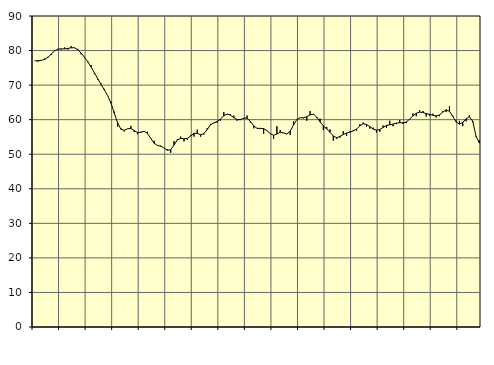
| Category | Piggar | Series 1 |
|---|---|---|
| nan | 77 | 77.01 |
| 87.0 | 76.8 | 77.05 |
| 87.0 | 77.1 | 77.18 |
| 87.0 | 77.7 | 77.41 |
| nan | 78.2 | 78.04 |
| 88.0 | 78.7 | 78.99 |
| 88.0 | 80.1 | 79.9 |
| 88.0 | 80.2 | 80.42 |
| nan | 80.3 | 80.49 |
| 89.0 | 80.9 | 80.5 |
| 89.0 | 80.3 | 80.61 |
| 89.0 | 81.3 | 80.8 |
| nan | 80.9 | 80.8 |
| 90.0 | 80.5 | 80.25 |
| 90.0 | 78.9 | 79.25 |
| 90.0 | 77.9 | 78.09 |
| nan | 76.6 | 76.79 |
| 91.0 | 75.8 | 75.27 |
| 91.0 | 73.2 | 73.56 |
| 91.0 | 71.6 | 71.87 |
| nan | 70.5 | 70.22 |
| 92.0 | 68.9 | 68.61 |
| 92.0 | 67 | 66.95 |
| 92.0 | 65.2 | 64.77 |
| nan | 62.3 | 61.89 |
| 93.0 | 58 | 59.05 |
| 93.0 | 57.5 | 57.22 |
| 93.0 | 56.6 | 56.93 |
| nan | 57.4 | 57.37 |
| 94.0 | 58.2 | 57.44 |
| 94.0 | 56.4 | 56.85 |
| 94.0 | 55.8 | 56.27 |
| nan | 56.2 | 56.4 |
| 95.0 | 56.5 | 56.61 |
| 95.0 | 56.5 | 56.01 |
| 95.0 | 54.6 | 54.56 |
| nan | 53.9 | 53.17 |
| 96.0 | 52.5 | 52.55 |
| 96.0 | 52.5 | 52.34 |
| 96.0 | 51.8 | 51.81 |
| nan | 51.4 | 51.13 |
| 97.0 | 50.4 | 51.31 |
| 97.0 | 53.8 | 52.66 |
| 97.0 | 54.4 | 54.11 |
| nan | 55.1 | 54.59 |
| 98.0 | 53.7 | 54.44 |
| 98.0 | 54.2 | 54.58 |
| 98.0 | 55.5 | 55.27 |
| nan | 55.1 | 56.06 |
| 99.0 | 57.1 | 56.03 |
| 99.0 | 55.1 | 55.64 |
| 99.0 | 55.7 | 55.92 |
| nan | 57.6 | 57.13 |
| 0.0 | 58.8 | 58.52 |
| 0.0 | 59 | 59.09 |
| 0.0 | 59.1 | 59.46 |
| nan | 59.7 | 60.18 |
| 1.0 | 62.2 | 61.11 |
| 1.0 | 61.5 | 61.64 |
| 1.0 | 61.6 | 61.3 |
| nan | 61.2 | 60.58 |
| 2.0 | 59.7 | 60.04 |
| 2.0 | 60.2 | 60 |
| 2.0 | 60.3 | 60.44 |
| nan | 61.2 | 60.44 |
| 3.0 | 59.2 | 59.51 |
| 3.0 | 57.5 | 58.22 |
| 3.0 | 57.5 | 57.49 |
| nan | 57.4 | 57.48 |
| 4.0 | 55.9 | 57.42 |
| 4.0 | 56.9 | 56.83 |
| 4.0 | 56 | 55.95 |
| nan | 54.4 | 55.49 |
| 5.0 | 58.1 | 55.84 |
| 5.0 | 57 | 56.36 |
| 5.0 | 56.2 | 56.16 |
| nan | 55.8 | 55.86 |
| 6.0 | 55.6 | 56.66 |
| 6.0 | 59.5 | 58.44 |
| 6.0 | 60 | 60.06 |
| nan | 60.6 | 60.56 |
| 7.0 | 60.4 | 60.55 |
| 7.0 | 59.7 | 60.88 |
| 7.0 | 62.5 | 61.4 |
| nan | 61.5 | 61.57 |
| 8.0 | 60.5 | 60.75 |
| 8.0 | 60.3 | 59.36 |
| 8.0 | 57 | 58.18 |
| nan | 57.9 | 57.31 |
| 9.0 | 57.2 | 56.37 |
| 9.0 | 53.9 | 55.28 |
| 9.0 | 54.4 | 54.77 |
| nan | 54.8 | 55.13 |
| 10.0 | 56.7 | 55.7 |
| 10.0 | 55.3 | 56.14 |
| 10.0 | 56.6 | 56.39 |
| nan | 56.9 | 56.72 |
| 11.0 | 56.8 | 57.3 |
| 11.0 | 58.7 | 58.18 |
| 11.0 | 59.2 | 58.8 |
| nan | 58 | 58.63 |
| 12.0 | 57.4 | 57.98 |
| 12.0 | 57.7 | 57.27 |
| 12.0 | 56.3 | 56.97 |
| nan | 56.5 | 57.14 |
| 13.0 | 58.3 | 57.76 |
| 13.0 | 57.6 | 58.34 |
| 13.0 | 59.7 | 58.51 |
| nan | 58.1 | 58.71 |
| 14.0 | 58.7 | 59 |
| 14.0 | 59.9 | 59.12 |
| 14.0 | 58.8 | 59.07 |
| nan | 59 | 59.34 |
| 15.0 | 60.2 | 60.15 |
| 15.0 | 61.8 | 61.11 |
| 15.0 | 61 | 61.84 |
| nan | 62.7 | 62.19 |
| 16.0 | 62.5 | 62.07 |
| 16.0 | 60.9 | 61.76 |
| 16.0 | 61.1 | 61.55 |
| nan | 61.7 | 61.27 |
| 17.0 | 60.6 | 61.09 |
| 17.0 | 61 | 61.37 |
| 17.0 | 62.5 | 62.18 |
| nan | 62.2 | 62.86 |
| 18.0 | 63.9 | 62.43 |
| 18.0 | 61.2 | 60.95 |
| 18.0 | 59.7 | 59.35 |
| nan | 59.6 | 58.7 |
| 19.0 | 58.1 | 59.22 |
| 19.0 | 59.5 | 60.23 |
| 19.0 | 61.3 | 60.86 |
| nan | 59.3 | 59.58 |
| 20.0 | 55.1 | 55.24 |
| 20.0 | 54.1 | 53.22 |